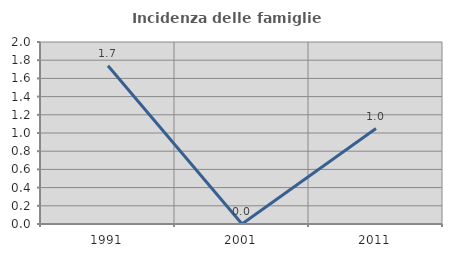
| Category | Incidenza delle famiglie numerose |
|---|---|
| 1991.0 | 1.739 |
| 2001.0 | 0 |
| 2011.0 | 1.049 |